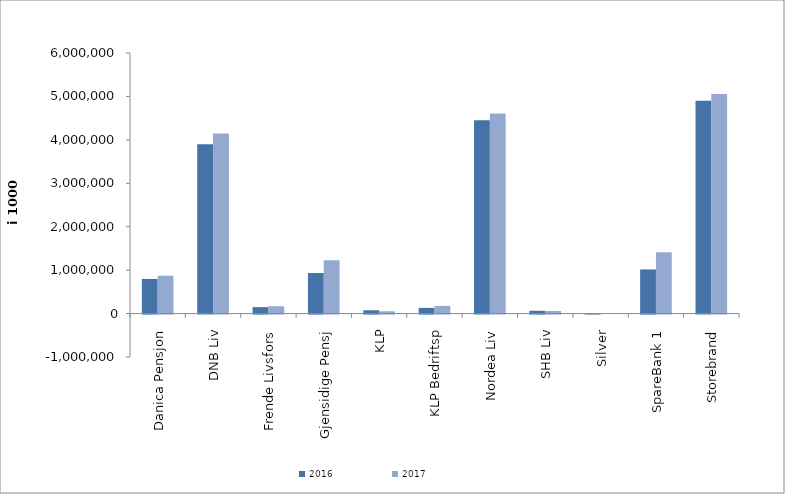
| Category | 2016 | 2017 |
|---|---|---|
| 0 | 797149.23 | 872284.589 |
| 1 | 3901376 | 4145174 |
| 2 | 148103 | 168384 |
| 3 | 934615.703 | 1226333 |
| 4 | 76382.539 | 52296.226 |
| 5 | 130945 | 176194 |
| 6 | 4451546.62 | 4608895.064 |
| 7 | 64356 | 59615 |
| 8 | -0.695 | 0 |
| 9 | 1016157.089 | 1413647.368 |
| 10 | 4898885.974 | 5054517.3 |